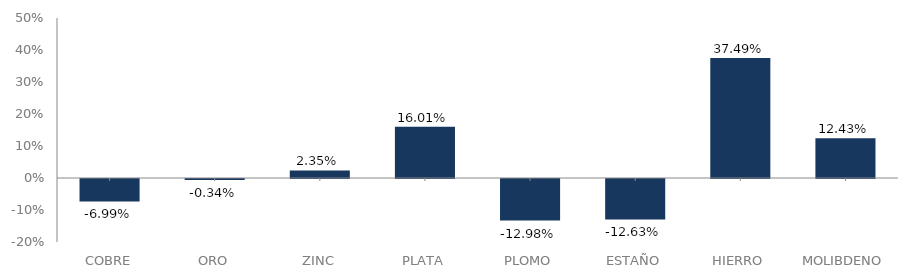
| Category | serie |
|---|---|
| 0 | -0.07 |
| 1 | -0.003 |
| 2 | 0.024 |
| 3 | 0.16 |
| 4 | -0.13 |
| 5 | -0.126 |
| 6 | 0.375 |
| 7 | 0.124 |